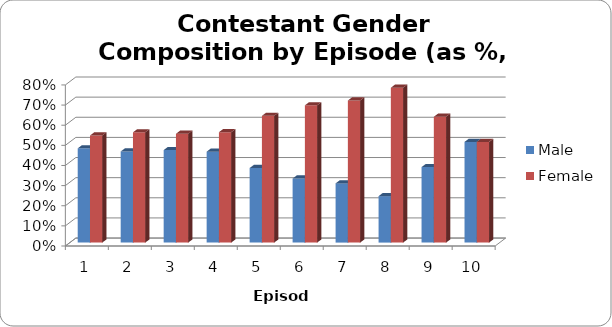
| Category | Male | Female |
|---|---|---|
| 0 | 0.468 | 0.532 |
| 1 | 0.452 | 0.548 |
| 2 | 0.459 | 0.541 |
| 3 | 0.452 | 0.548 |
| 4 | 0.37 | 0.63 |
| 5 | 0.318 | 0.682 |
| 6 | 0.294 | 0.706 |
| 7 | 0.231 | 0.769 |
| 8 | 0.375 | 0.625 |
| 9 | 0.5 | 0.5 |